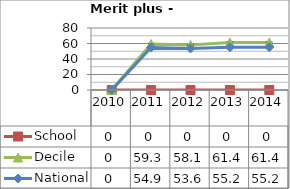
| Category | School  | Decile | National |
|---|---|---|---|
| 2010.0 | 0 | 0 | 0 |
| 2011.0 | 0 | 59.3 | 54.9 |
| 2012.0 | 0 | 58.1 | 53.6 |
| 2013.0 | 0 | 61.4 | 55.2 |
| 2014.0 | 0 | 61.4 | 55.2 |